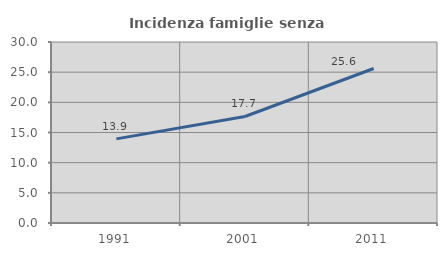
| Category | Incidenza famiglie senza nuclei |
|---|---|
| 1991.0 | 13.942 |
| 2001.0 | 17.655 |
| 2011.0 | 25.612 |